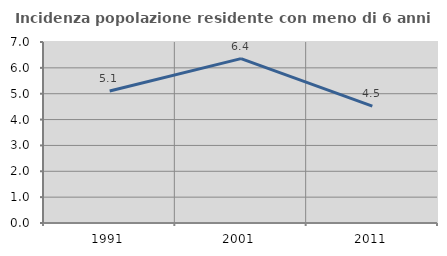
| Category | Incidenza popolazione residente con meno di 6 anni |
|---|---|
| 1991.0 | 5.102 |
| 2001.0 | 6.356 |
| 2011.0 | 4.523 |